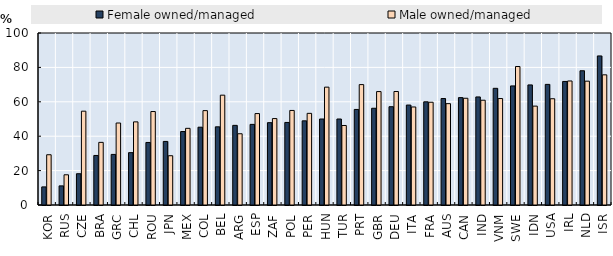
| Category | Female owned/managed | Male owned/managed |
|---|---|---|
| KOR | 10.526 | 29.218 |
| RUS | 11.111 | 17.568 |
| CZE | 18.182 | 54.545 |
| BRA | 28.8 | 36.418 |
| GRC | 29.412 | 47.674 |
| CHL | 30.435 | 48.333 |
| ROU | 36.364 | 54.348 |
| JPN | 36.957 | 28.647 |
| MEX | 42.708 | 44.568 |
| COL | 45.238 | 54.874 |
| BEL | 45.455 | 63.855 |
| ARG | 46.296 | 41.423 |
| ESP | 46.875 | 53.153 |
| ZAF | 47.872 | 50.249 |
| POL | 48 | 54.972 |
| PER | 48.936 | 53.285 |
| HUN | 50 | 68.519 |
| TUR | 50 | 46.226 |
| PRT | 55.556 | 70 |
| GBR | 56.25 | 65.95 |
| DEU | 57.143 | 65.997 |
| ITA | 58.108 | 56.993 |
| FRA | 60 | 59.744 |
| AUS | 61.905 | 58.923 |
| CAN | 62.428 | 62.06 |
| IND | 62.821 | 60.912 |
| VNM | 67.836 | 61.898 |
| SWE | 69.231 | 80.519 |
| IDN | 69.811 | 57.492 |
| USA | 70.122 | 61.78 |
| IRL | 71.831 | 72.105 |
| NLD | 78.049 | 72 |
| ISR | 86.667 | 75.676 |